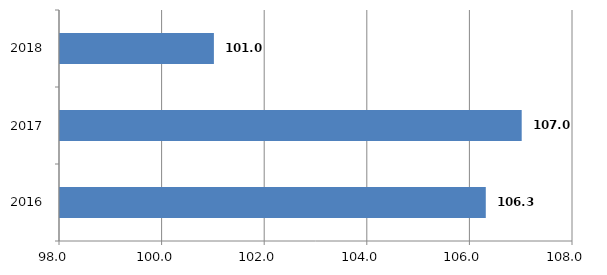
| Category | Series 0 |
|---|---|
| 2016.0 | 106.3 |
| 2017.0 | 107 |
| 2018.0 | 101 |